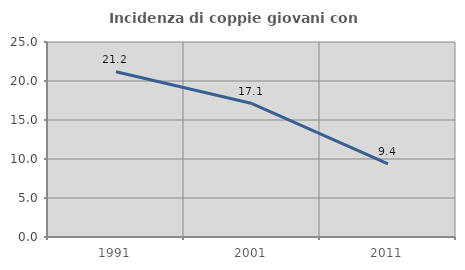
| Category | Incidenza di coppie giovani con figli |
|---|---|
| 1991.0 | 21.196 |
| 2001.0 | 17.114 |
| 2011.0 | 9.361 |